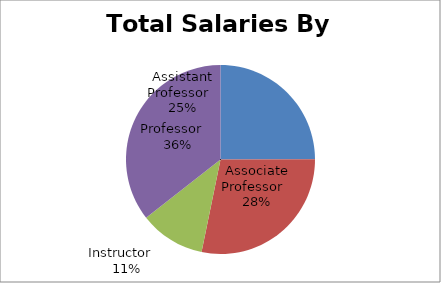
| Category | Total Salaries |
|---|---|
| Assistant Professor   | 1769508 |
| Associate Professor   | 2002875 |
| Instructor    | 794734 |
| Professor    | 2521796 |